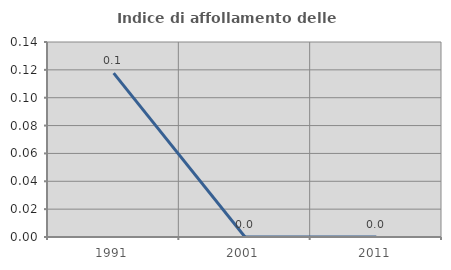
| Category | Indice di affollamento delle abitazioni  |
|---|---|
| 1991.0 | 0.118 |
| 2001.0 | 0 |
| 2011.0 | 0 |